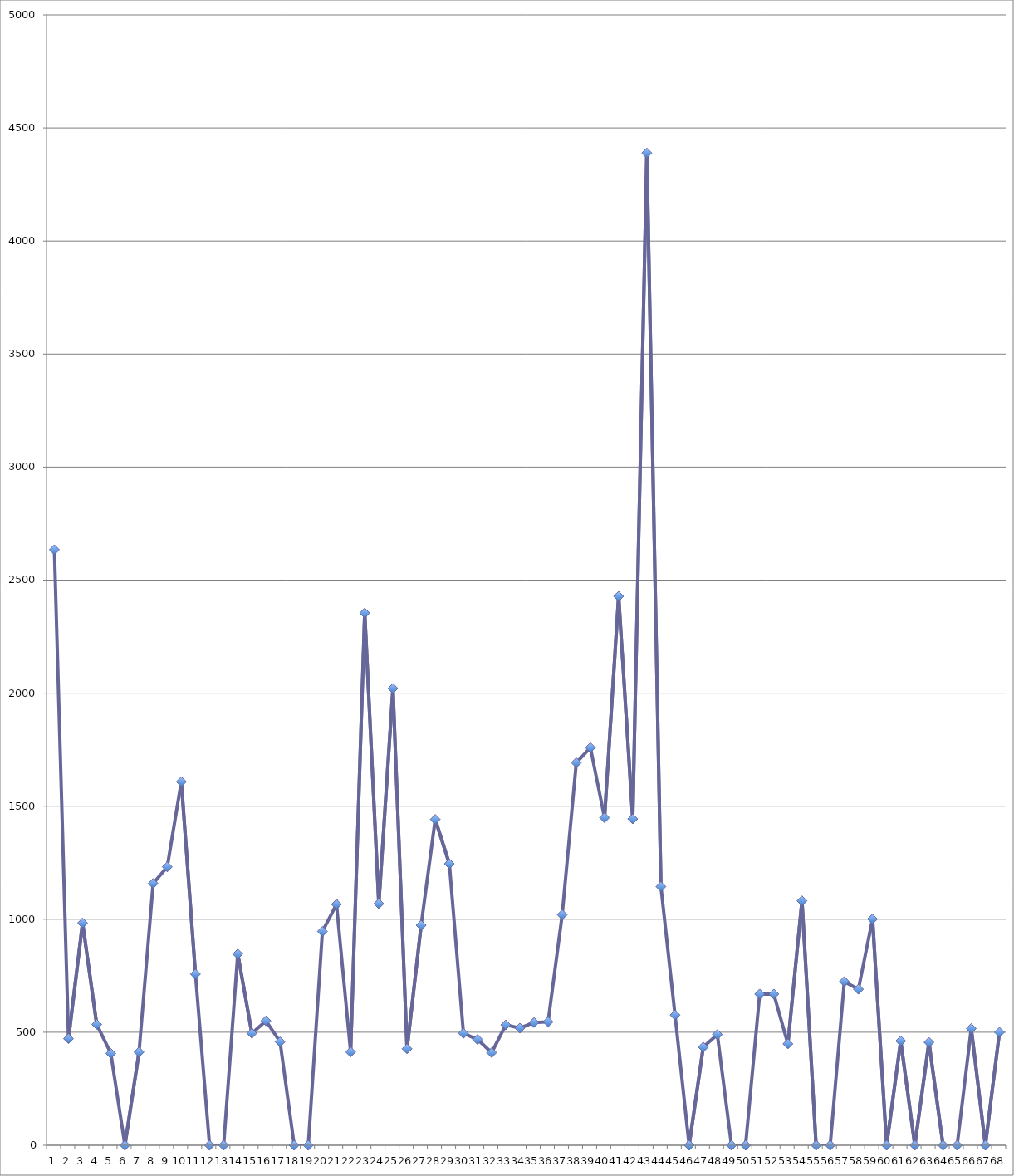
| Category | Series 0 |
|---|---|
| 0 | 2634.265 |
| 1 | 471.512 |
| 2 | 983.38 |
| 3 | 534.577 |
| 4 | 406.166 |
| 5 | 0 |
| 6 | 412.138 |
| 7 | 1158.126 |
| 8 | 1231.463 |
| 9 | 1608.38 |
| 10 | 757.152 |
| 11 | 0 |
| 12 | 0 |
| 13 | 846.04 |
| 14 | 495.306 |
| 15 | 550.297 |
| 16 | 457.601 |
| 17 | 0 |
| 18 | 0 |
| 19 | 946.005 |
| 20 | 1065.758 |
| 21 | 412.817 |
| 22 | 2354.371 |
| 23 | 1068.772 |
| 24 | 2020.883 |
| 25 | 426.943 |
| 26 | 973.321 |
| 27 | 1441.546 |
| 28 | 1245.148 |
| 29 | 494.999 |
| 30 | 468.153 |
| 31 | 409.892 |
| 32 | 532.445 |
| 33 | 518.316 |
| 34 | 542.86 |
| 35 | 545.976 |
| 36 | 1019.765 |
| 37 | 1692.286 |
| 38 | 1758.911 |
| 39 | 1449.175 |
| 40 | 2428.393 |
| 41 | 1443.769 |
| 42 | 4389.293 |
| 43 | 1144.246 |
| 44 | 576.035 |
| 45 | 0 |
| 46 | 434.316 |
| 47 | 489.652 |
| 48 | 0 |
| 49 | 0 |
| 50 | 668.787 |
| 51 | 668.864 |
| 52 | 448.569 |
| 53 | 1081.333 |
| 54 | 0 |
| 55 | 0 |
| 56 | 724.194 |
| 57 | 690.292 |
| 58 | 1001.019 |
| 59 | 0 |
| 60 | 461.593 |
| 61 | 0 |
| 62 | 455.463 |
| 63 | 0 |
| 64 | 0 |
| 65 | 516.553 |
| 66 | 0 |
| 67 | 499.676 |